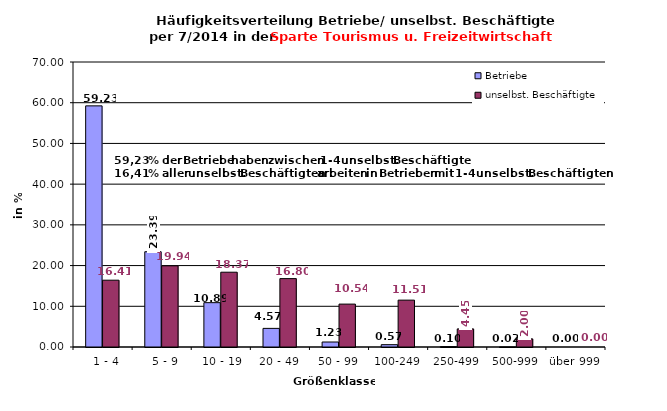
| Category | Betriebe | unselbst. Beschäftigte |
|---|---|---|
|   1 - 4 | 59.227 | 16.407 |
|   5 - 9 | 23.395 | 19.937 |
|  10 - 19 | 10.891 | 18.371 |
| 20 - 49 | 4.571 | 16.796 |
| 50 - 99 | 1.227 | 10.535 |
| 100-249 | 0.571 | 11.511 |
| 250-499 | 0.101 | 4.446 |
| 500-999 | 0.017 | 1.997 |
| über 999 | 0 | 0 |